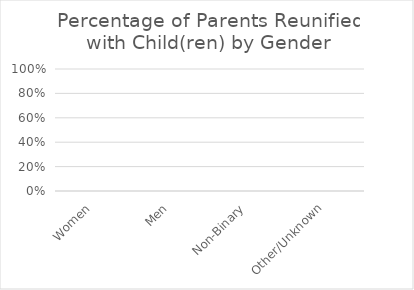
| Category | % of Reunified |
|---|---|
| Women | 0 |
| Men | 0 |
| Non-Binary | 0 |
| Other/Unknown | 0 |